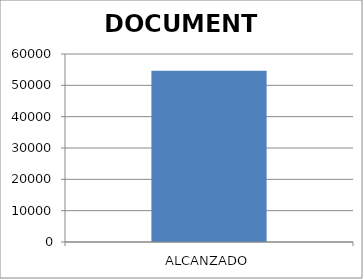
| Category | DOCUMENTO |
|---|---|
| ALCANZADO | 54649 |